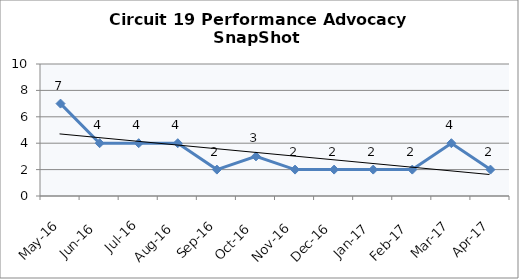
| Category | Circuit 19 |
|---|---|
| May-16 | 7 |
| Jun-16 | 4 |
| Jul-16 | 4 |
| Aug-16 | 4 |
| Sep-16 | 2 |
| Oct-16 | 3 |
| Nov-16 | 2 |
| Dec-16 | 2 |
| Jan-17 | 2 |
| Feb-17 | 2 |
| Mar-17 | 4 |
| Apr-17 | 2 |